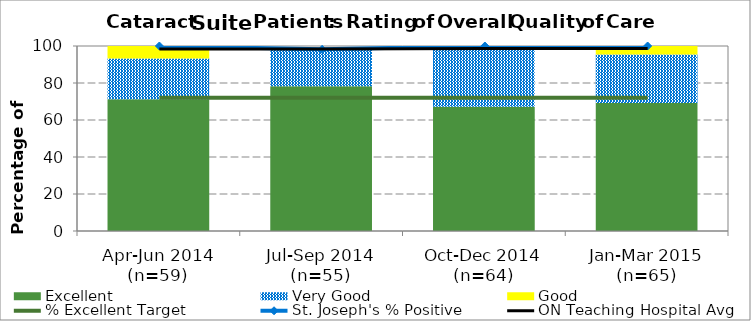
| Category | Excellent | Very Good | Good |
|---|---|---|---|
| Apr-Jun 2014 (n=59) | 71.19 | 22.03 | 6.78 |
| Jul-Sep 2014 (n=55) | 78.18 | 20 | 0 |
| Oct-Dec 2014 (n=64) | 67.19 | 31.25 | 1.56 |
| Jan-Mar 2015 (n=65) | 69.23 | 26.15 | 4.62 |